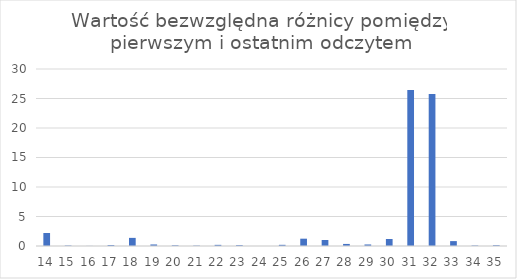
| Category | Wartość bezwzględna różnicy |
|---|---|
| 14.0 | 2.202 |
| 15.0 | 0.081 |
| 16.0 | 0.017 |
| 17.0 | 0.163 |
| 18.0 | 1.376 |
| 19.0 | 0.26 |
| 20.0 | 0.12 |
| 21.0 | 0.067 |
| 22.0 | 0.195 |
| 23.0 | 0.147 |
| 24.0 | 0 |
| 25.0 | 0.2 |
| 26.0 | 1.24 |
| 27.0 | 1.02 |
| 28.0 | 0.35 |
| 29.0 | 0.26 |
| 30.0 | 1.183 |
| 31.0 | 26.437 |
| 32.0 | 25.767 |
| 33.0 | 0.829 |
| 34.0 | 0.083 |
| 35.0 | 0.136 |